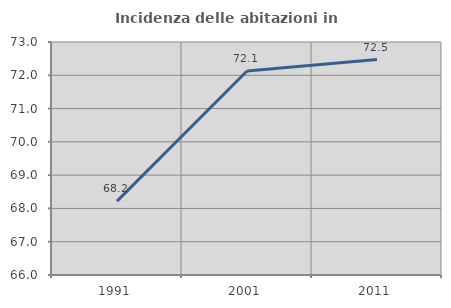
| Category | Incidenza delle abitazioni in proprietà  |
|---|---|
| 1991.0 | 68.218 |
| 2001.0 | 72.128 |
| 2011.0 | 72.473 |